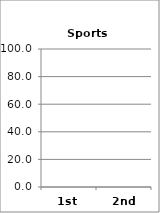
| Category | Sports (Choices) |
|---|---|
| 1st | 0 |
| 2nd | 0 |